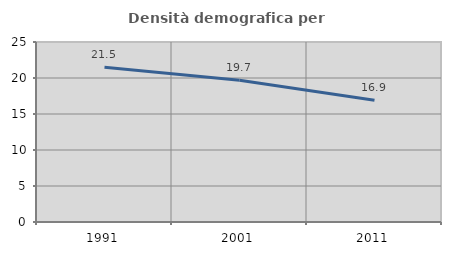
| Category | Densità demografica |
|---|---|
| 1991.0 | 21.484 |
| 2001.0 | 19.698 |
| 2011.0 | 16.909 |